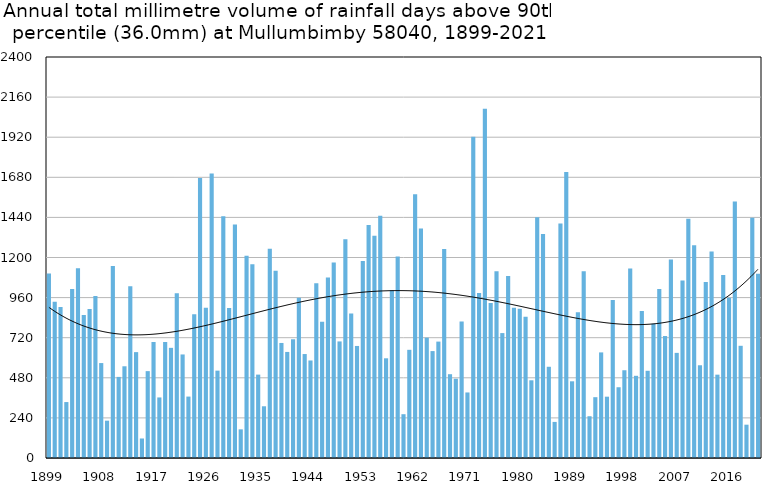
| Category | Annual total mm in days above 90th percentile |
|---|---|
| 1899 | 1104.4 |
| 1900 | 935.7 |
| 1901 | 903.5 |
| 1902 | 334.8 |
| 1903 | 1011.7 |
| 1904 | 1135 |
| 1905 | 855.8 |
| 1906 | 891.4 |
| 1907 | 968.9 |
| 1908 | 568.2 |
| 1909 | 223.4 |
| 1910 | 1149.7 |
| 1911 | 485.4 |
| 1912 | 549 |
| 1913 | 1027.6 |
| 1914 | 633.7 |
| 1915 | 116.8 |
| 1916 | 519.9 |
| 1917 | 694.4 |
| 1918 | 362.5 |
| 1919 | 694.2 |
| 1920 | 659.3 |
| 1921 | 986.6 |
| 1922 | 619.7 |
| 1923 | 367.6 |
| 1924 | 860.5 |
| 1925 | 1675.9 |
| 1926 | 899.8 |
| 1927 | 1702.9 |
| 1928 | 522.8 |
| 1929 | 1447.5 |
| 1930 | 898.5 |
| 1931 | 1396.8 |
| 1932 | 171.5 |
| 1933 | 1210.3 |
| 1934 | 1160 |
| 1935 | 499.1 |
| 1936 | 309.6 |
| 1937 | 1252.1 |
| 1938 | 1120.4 |
| 1939 | 688.5 |
| 1940 | 634.8 |
| 1941 | 710.6 |
| 1942 | 959.8 |
| 1943 | 622.2 |
| 1944 | 583.7 |
| 1945 | 1045.3 |
| 1946 | 814.8 |
| 1947 | 1081 |
| 1948 | 1170.2 |
| 1949 | 697.7 |
| 1950 | 1309.8 |
| 1951 | 865.4 |
| 1952 | 670.6 |
| 1953 | 1178.4 |
| 1954 | 1394.2 |
| 1955 | 1330.6 |
| 1956 | 1449.7 |
| 1957 | 596.7 |
| 1958 | 1003.5 |
| 1959 | 1206.3 |
| 1960 | 262.1 |
| 1961 | 647.5 |
| 1962 | 1578.6 |
| 1963 | 1373.1 |
| 1964 | 720.3 |
| 1965 | 639.9 |
| 1966 | 696.7 |
| 1967 | 1250.9 |
| 1968 | 501.5 |
| 1969 | 474.5 |
| 1970 | 817.4 |
| 1971 | 392.3 |
| 1972 | 1922.2 |
| 1973 | 987.8 |
| 1974 | 2090.8 |
| 1975 | 927 |
| 1976 | 1117.6 |
| 1977 | 747.6 |
| 1978 | 1089.6 |
| 1979 | 899.4 |
| 1980 | 893.4 |
| 1981 | 845 |
| 1982 | 465 |
| 1983 | 1441.4 |
| 1984 | 1341 |
| 1985 | 546 |
| 1986 | 216 |
| 1987 | 1403 |
| 1988 | 1712 |
| 1989 | 459 |
| 1990 | 872 |
| 1991 | 1118 |
| 1992 | 250 |
| 1993 | 364 |
| 1994 | 632 |
| 1995 | 367 |
| 1996 | 945.4 |
| 1997 | 423.5 |
| 1998 | 525.2 |
| 1999 | 1133.8 |
| 2000 | 492 |
| 2001 | 879.2 |
| 2002 | 522 |
| 2003 | 804 |
| 2004 | 1012 |
| 2005 | 730 |
| 2006 | 1188.6 |
| 2007 | 629.2 |
| 2008 | 1062 |
| 2009 | 1432 |
| 2010 | 1273.6 |
| 2011 | 555 |
| 2012 | 1054 |
| 2013 | 1235.6 |
| 2014 | 498.8 |
| 2015 | 1095.8 |
| 2016 | 959.2 |
| 2017 | 1535.6 |
| 2018 | 671.6 |
| 2019 | 199.4 |
| 2020 | 1438.6 |
| 2021 | 1102.8 |